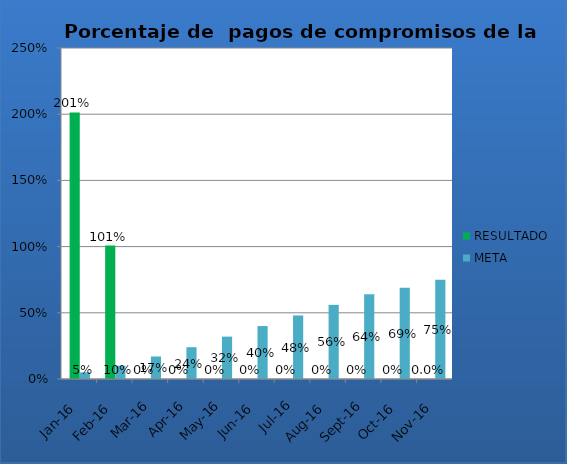
| Category | RESULTADO | META |
|---|---|---|
| ene-16 | 2.013 | 0.05 |
| feb-16 | 1.008 | 0.1 |
| mar-16 | 0 | 0.17 |
| abr-16 | 0 | 0.24 |
| may-16 | 0 | 0.32 |
| jun-16 | 0 | 0.4 |
| jul-16 | 0 | 0.48 |
| ago-16 | 0 | 0.56 |
| sep-16 | 0 | 0.64 |
| oct-16 | 0 | 0.69 |
| nov-16 | 0 | 0.75 |